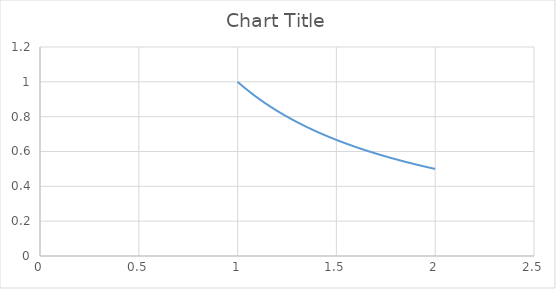
| Category | Series 0 |
|---|---|
| 1.0 | 1 |
| 1.02 | 0.98 |
| 1.04 | 0.962 |
| 1.06 | 0.943 |
| 1.08 | 0.926 |
| 1.1 | 0.909 |
| 1.12 | 0.893 |
| 1.1400000000000001 | 0.877 |
| 1.16 | 0.862 |
| 1.18 | 0.847 |
| 1.2 | 0.833 |
| 1.22 | 0.82 |
| 1.24 | 0.806 |
| 1.26 | 0.794 |
| 1.28 | 0.781 |
| 1.3 | 0.769 |
| 1.32 | 0.758 |
| 1.34 | 0.746 |
| 1.3599999999999999 | 0.735 |
| 1.38 | 0.725 |
| 1.4 | 0.714 |
| 1.42 | 0.704 |
| 1.44 | 0.694 |
| 1.46 | 0.685 |
| 1.48 | 0.676 |
| 1.5 | 0.667 |
| 1.52 | 0.658 |
| 1.54 | 0.649 |
| 1.56 | 0.641 |
| 1.58 | 0.633 |
| 1.6 | 0.625 |
| 1.62 | 0.617 |
| 1.6400000000000001 | 0.61 |
| 1.6600000000000001 | 0.602 |
| 1.6800000000000002 | 0.595 |
| 1.7000000000000002 | 0.588 |
| 1.72 | 0.581 |
| 1.74 | 0.575 |
| 1.76 | 0.568 |
| 1.78 | 0.562 |
| 1.8 | 0.556 |
| 1.82 | 0.549 |
| 1.8399999999999999 | 0.543 |
| 1.8599999999999999 | 0.538 |
| 1.88 | 0.532 |
| 1.9 | 0.526 |
| 1.92 | 0.521 |
| 1.94 | 0.515 |
| 1.96 | 0.51 |
| 1.98 | 0.505 |
| 2.0 | 0.5 |